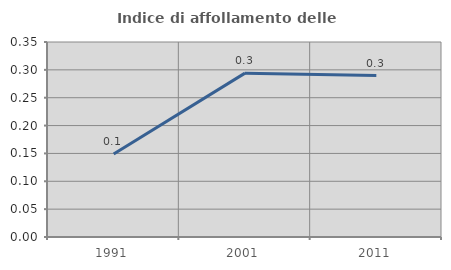
| Category | Indice di affollamento delle abitazioni  |
|---|---|
| 1991.0 | 0.149 |
| 2001.0 | 0.294 |
| 2011.0 | 0.29 |